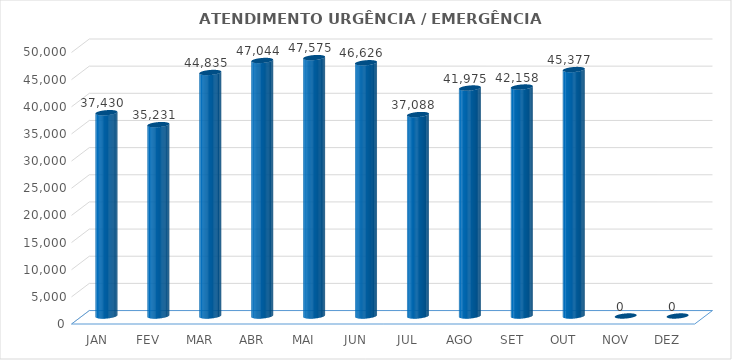
| Category | Series 0 |
|---|---|
| JAN | 37430 |
| FEV | 35231 |
| MAR | 44835 |
| ABR | 47044 |
| MAI | 47575 |
| JUN | 46626 |
| JUL | 37088 |
| AGO | 41975 |
| SET | 42158 |
| OUT | 45377 |
| NOV | 0 |
| DEZ | 0 |